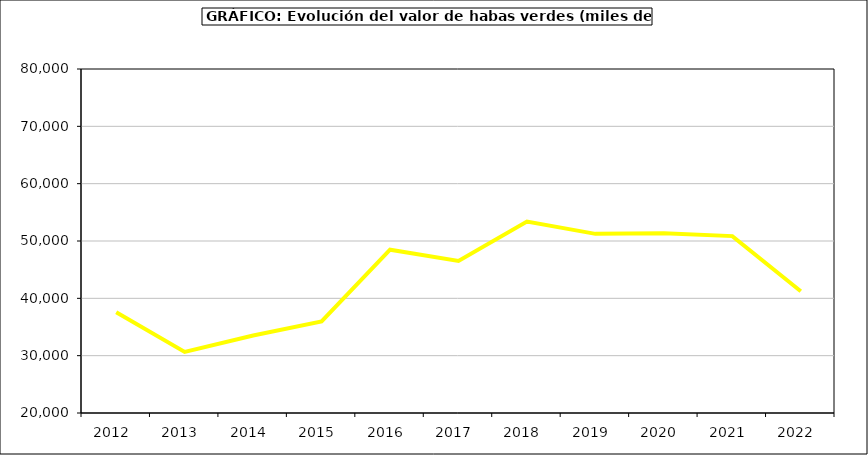
| Category | Valor |
|---|---|
| 2012.0 | 37566.616 |
| 2013.0 | 30653.095 |
| 2014.0 | 33509.136 |
| 2015.0 | 35980 |
| 2016.0 | 48480 |
| 2017.0 | 46515.376 |
| 2018.0 | 53389.01 |
| 2019.0 | 51247.117 |
| 2020.0 | 51358.243 |
| 2021.0 | 50852.815 |
| 2022.0 | 41238.194 |